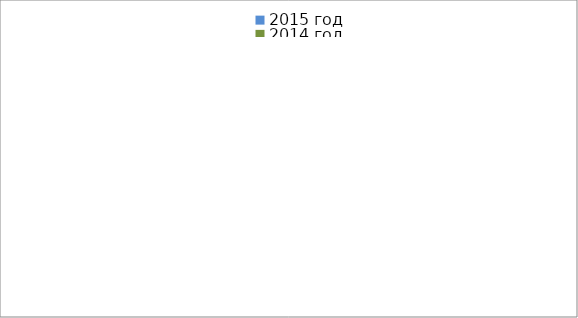
| Category | 2015 год | 2014 год |
|---|---|---|
|  - поджог | 29 | 25 |
|  - неосторожное обращение с огнём | 62 | 45 |
|  - НПТЭ электрооборудования | 10 | 20 |
|  - НПУ и Э печей | 69 | 70 |
|  - НПУ и Э транспортных средств | 44 | 62 |
|   -Шалость с огнем детей | 3 | 0 |
|  -НППБ при эксплуатации эл.приборов | 14 | 20 |
|  - курение | 26 | 22 |
| - прочие | 100 | 100 |
| - не установленные причины | 13 | 10 |